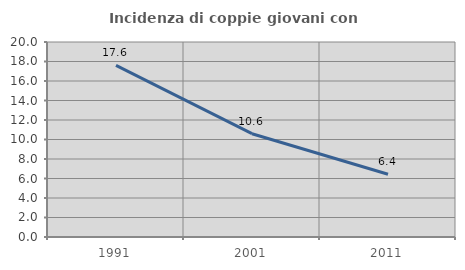
| Category | Incidenza di coppie giovani con figli |
|---|---|
| 1991.0 | 17.606 |
| 2001.0 | 10.596 |
| 2011.0 | 6.431 |